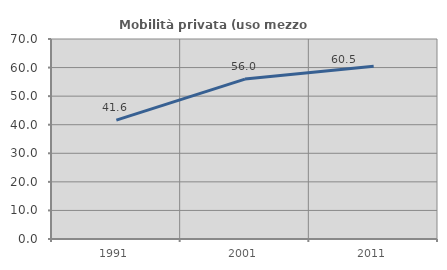
| Category | Mobilità privata (uso mezzo privato) |
|---|---|
| 1991.0 | 41.612 |
| 2001.0 | 55.973 |
| 2011.0 | 60.487 |